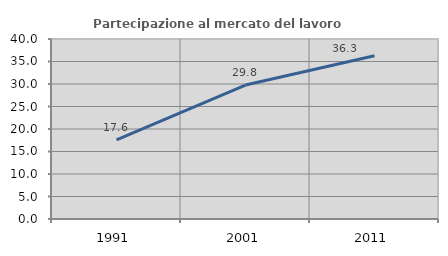
| Category | Partecipazione al mercato del lavoro  femminile |
|---|---|
| 1991.0 | 17.6 |
| 2001.0 | 29.771 |
| 2011.0 | 36.296 |